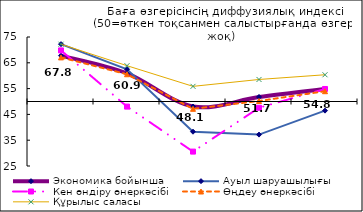
| Category | Экономика бойынша | Ауыл шаруашылығы | Кен өндіру өнеркәсібі | Өңдеу өнеркәсібі | Құрылыс саласы |
|---|---|---|---|---|---|
| 0 | 67.77 | 72.222 | 69.802 | 67.094 | 72.199 |
| 1 | 60.895 | 62.5 | 48.02 | 60.565 | 63.878 |
| 2 | 48.06 | 38.288 | 30.583 | 47.158 | 55.87 |
| 3 | 51.745 | 37.168 | 47.573 | 50.204 | 58.537 |
| 4 | 54.835 | 46.46 | 54.854 | 53.988 | 60.366 |